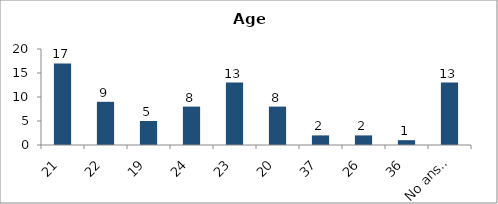
| Category | Age |
|---|---|
| 21 | 17 |
| 22 | 9 |
| 19 | 5 |
| 24 | 8 |
| 23 | 13 |
| 20 | 8 |
| 37 | 2 |
| 26 | 2 |
| 36 | 1 |
| No answer | 13 |